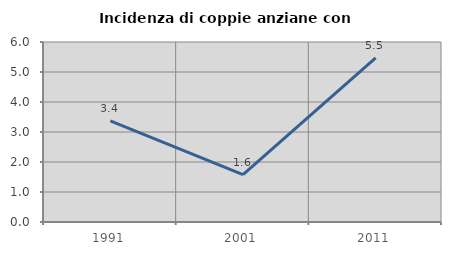
| Category | Incidenza di coppie anziane con figli |
|---|---|
| 1991.0 | 3.371 |
| 2001.0 | 1.581 |
| 2011.0 | 5.474 |